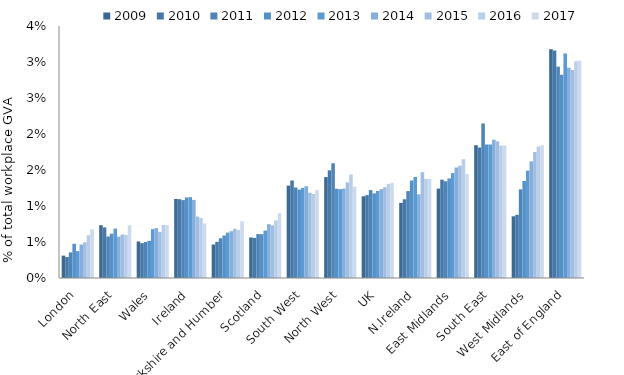
| Category | 2009 | 2010 | 2011 | 2012 | 2013 | 2014 | 2015 | 2016 | 2017 |
|---|---|---|---|---|---|---|---|---|---|
| London | 0.003 | 0.003 | 0.004 | 0.005 | 0.004 | 0.005 | 0.005 | 0.006 | 0.007 |
| North East | 0.007 | 0.007 | 0.006 | 0.006 | 0.007 | 0.006 | 0.006 | 0.006 | 0.007 |
| Wales | 0.005 | 0.005 | 0.005 | 0.005 | 0.007 | 0.007 | 0.006 | 0.007 | 0.007 |
| Ireland | 0.011 | 0.011 | 0.011 | 0.011 | 0.011 | 0.011 | 0.009 | 0.008 | 0.008 |
| Yorkshire and Humber | 0.005 | 0.005 | 0.006 | 0.006 | 0.006 | 0.006 | 0.007 | 0.007 | 0.008 |
| Scotland | 0.006 | 0.006 | 0.006 | 0.006 | 0.007 | 0.007 | 0.007 | 0.008 | 0.009 |
| South West | 0.013 | 0.014 | 0.013 | 0.012 | 0.013 | 0.013 | 0.012 | 0.012 | 0.012 |
| North West | 0.014 | 0.015 | 0.016 | 0.012 | 0.012 | 0.012 | 0.013 | 0.014 | 0.013 |
| UK | 0.011 | 0.012 | 0.012 | 0.012 | 0.012 | 0.012 | 0.013 | 0.013 | 0.013 |
| N.Ireland | 0.01 | 0.011 | 0.012 | 0.014 | 0.014 | 0.012 | 0.015 | 0.014 | 0.014 |
| East Midlands | 0.012 | 0.014 | 0.013 | 0.014 | 0.015 | 0.015 | 0.016 | 0.016 | 0.014 |
| South East | 0.018 | 0.018 | 0.021 | 0.019 | 0.019 | 0.019 | 0.019 | 0.018 | 0.018 |
| West Midlands | 0.009 | 0.009 | 0.012 | 0.013 | 0.015 | 0.016 | 0.018 | 0.018 | 0.018 |
| East of England | 0.032 | 0.032 | 0.029 | 0.028 | 0.031 | 0.029 | 0.029 | 0.03 | 0.03 |